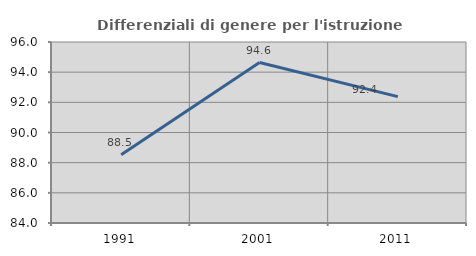
| Category | Differenziali di genere per l'istruzione superiore |
|---|---|
| 1991.0 | 88.518 |
| 2001.0 | 94.638 |
| 2011.0 | 92.376 |